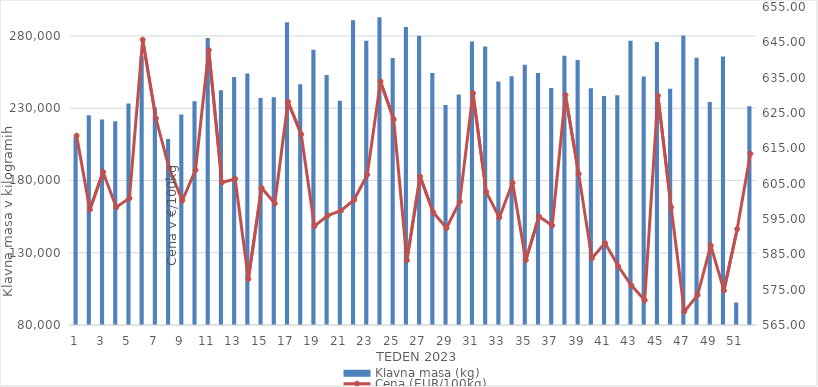
| Category | Klavna masa (kg) |
|---|---|
| 0 | 209877 |
| 1 | 225045 |
| 2 | 222198 |
| 3 | 221002 |
| 4 | 233306 |
| 5 | 265944 |
| 6 | 230531 |
| 7 | 208699 |
| 8 | 225712 |
| 9 | 234762 |
| 10 | 278467 |
| 11 | 242369 |
| 12 | 251507 |
| 13 | 254072 |
| 14 | 236964 |
| 15 | 237552 |
| 16 | 289400 |
| 17 | 246616 |
| 18 | 270374 |
| 19 | 252984 |
| 20 | 235060 |
| 21 | 290816 |
| 22 | 276702 |
| 23 | 292976 |
| 24 | 264669 |
| 25 | 286237 |
| 26 | 280112 |
| 27 | 254336 |
| 28 | 232178 |
| 29 | 239437 |
| 30 | 276163 |
| 31 | 272647 |
| 32 | 248536 |
| 33 | 252050 |
| 34 | 260110 |
| 35 | 254389 |
| 36 | 243933 |
| 37 | 266321 |
| 38 | 263346 |
| 39 | 243765 |
| 40 | 238404 |
| 41 | 239007 |
| 42 | 276684 |
| 43 | 251832 |
| 44 | 275816 |
| 45 | 243425 |
| 46 | 280350 |
| 47 | 264849 |
| 48 | 234308 |
| 49 | 265786 |
| 50 | 95590 |
| 51 | 231370 |